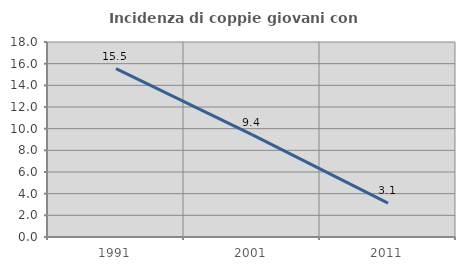
| Category | Incidenza di coppie giovani con figli |
|---|---|
| 1991.0 | 15.548 |
| 2001.0 | 9.449 |
| 2011.0 | 3.125 |